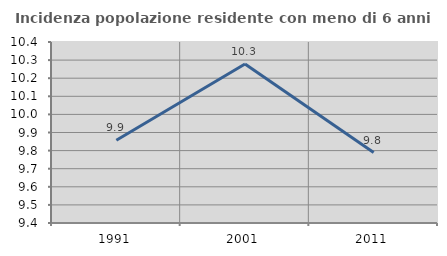
| Category | Incidenza popolazione residente con meno di 6 anni |
|---|---|
| 1991.0 | 9.857 |
| 2001.0 | 10.278 |
| 2011.0 | 9.789 |